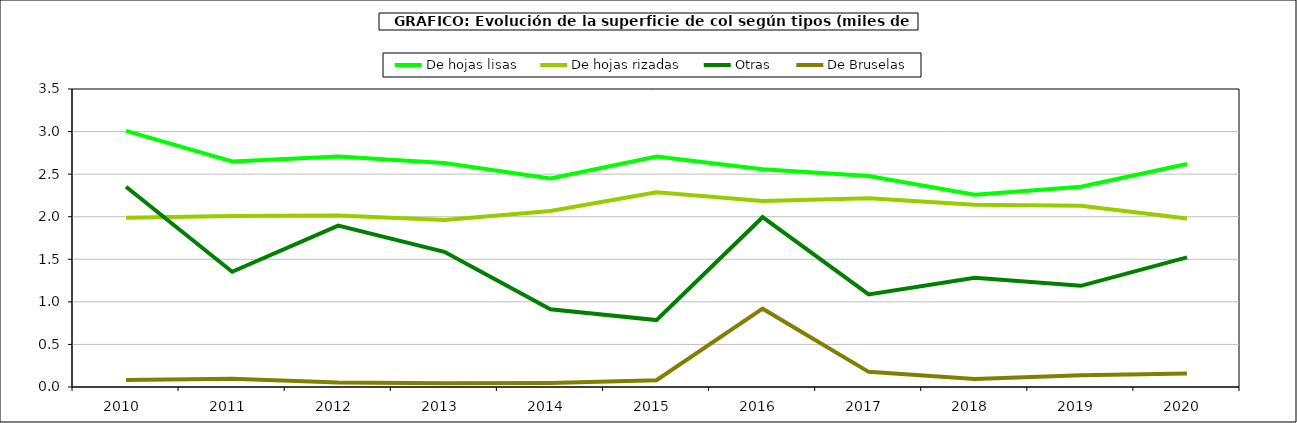
| Category | De hojas lisas | De hojas rizadas | Otras | De Bruselas |
|---|---|---|---|---|
| 2010.0 | 3.008 | 1.987 | 2.352 | 0.083 |
| 2011.0 | 2.648 | 2.008 | 1.354 | 0.098 |
| 2012.0 | 2.707 | 2.014 | 1.895 | 0.053 |
| 2013.0 | 2.631 | 1.962 | 1.588 | 0.043 |
| 2014.0 | 2.45 | 2.067 | 0.914 | 0.048 |
| 2015.0 | 2.707 | 2.288 | 0.786 | 0.08 |
| 2016.0 | 2.557 | 2.186 | 1.994 | 0.92 |
| 2017.0 | 2.479 | 2.218 | 1.087 | 0.178 |
| 2018.0 | 2.257 | 2.141 | 1.282 | 0.094 |
| 2019.0 | 2.351 | 2.128 | 1.188 | 0.139 |
| 2020.0 | 2.62 | 1.979 | 1.523 | 0.16 |